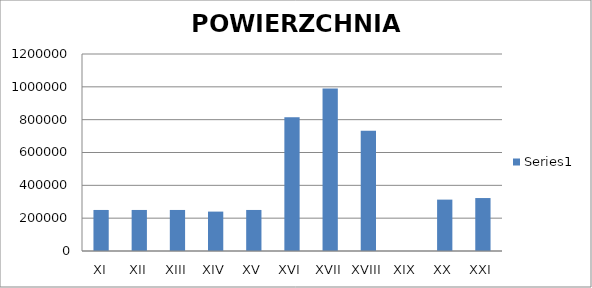
| Category | Series 0 |
|---|---|
| XI | 250000 |
| XII | 250000 |
| XIII | 250000 |
| XIV | 240000 |
| XV | 250000 |
| XVI | 815000 |
| XVII | 990000 |
| XVIII | 733000 |
| XIX | 0 |
| XX | 313000 |
| XXI | 322575 |